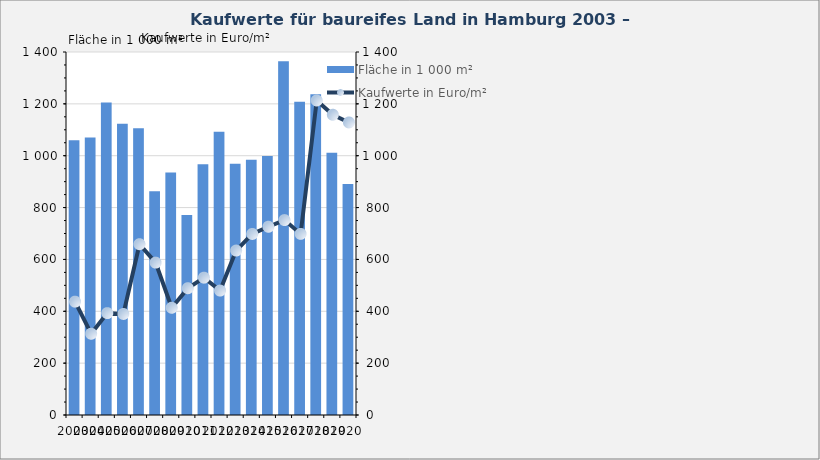
| Category | Fläche in 1 000 m² |
|---|---|
| 2003.0 | 1059.8 |
| 2004.0 | 1070.3 |
| 2005.0 | 1204.8 |
| 2006.0 | 1123.1 |
| 2007.0 | 1105.8 |
| 2008.0 | 863.2 |
| 2009.0 | 934.9 |
| 2010.0 | 771 |
| 2011.0 | 967 |
| 2012.0 | 1092 |
| 2013.0 | 969 |
| 2014.0 | 984 |
| 2015.0 | 999 |
| 2016.0 | 1364 |
| 2017.0 | 1208 |
| 2018.0 | 1237 |
| 2019.0 | 1011 |
| 2020.0 | 891 |